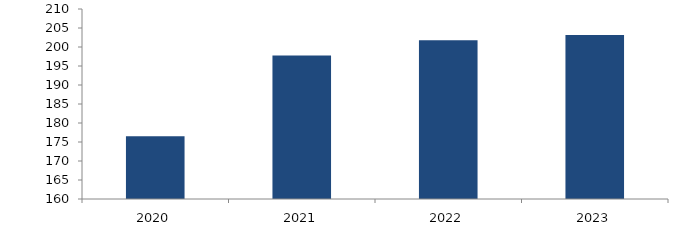
| Category | Bogotá |
|---|---|
| 2020.0 | 176.523 |
| 2021.0 | 197.767 |
| 2022.0 | 201.764 |
| 2023.0 | 203.15 |